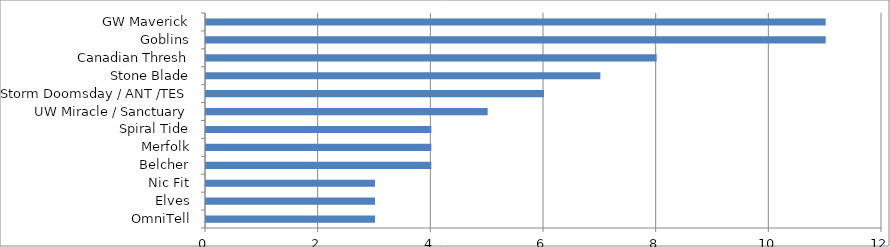
| Category | Series 0 |
|---|---|
| OmniTell | 3 |
| Elves | 3 |
| Nic Fit | 3 |
| Belcher | 4 |
| Merfolk | 4 |
| Spiral Tide | 4 |
| UW Miracle / Sanctuary | 5 |
| Storm Doomsday / ANT /TES | 6 |
| Stone Blade | 7 |
| Canadian Thresh | 8 |
| Goblins | 11 |
| GW Maverick | 11 |